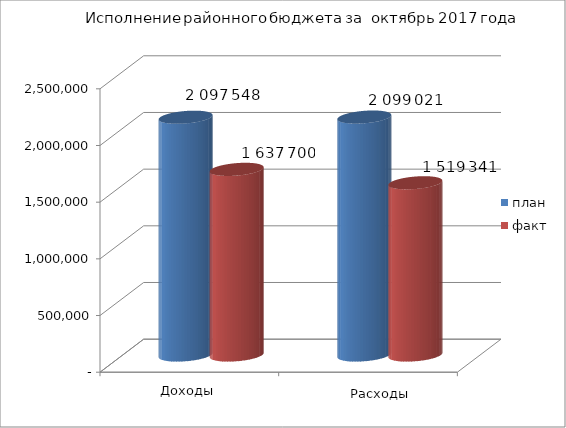
| Category | план | факт |
|---|---|---|
| 0 | 2097548 | 1637700 |
| 1 | 2099021 | 1519341.32 |